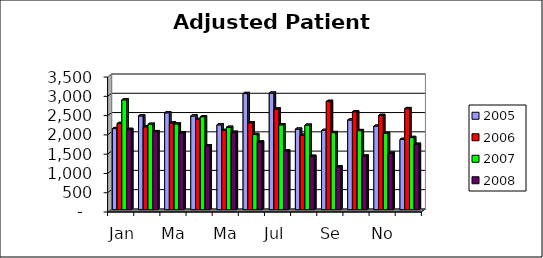
| Category | 2004 | 2005 | 2006 | 2007 | 2008 |
|---|---|---|---|---|---|
| Jan |  | 2101.477 | 2233.487 | 2847.642 | 2079.641 |
| Feb |  | 2429.972 | 2148.437 | 2212.652 | 2021.784 |
| Mar |  | 2511.316 | 2244.971 | 2220.498 | 1991.988 |
| Apr |  | 2429.029 | 2338.256 | 2408.74 | 1656.089 |
| May |  | 2199.625 | 2053.385 | 2134.922 | 2004.858 |
| Jun |  | 3010.699 | 2253.3 | 1947.715 | 1753.574 |
| Jul |  | 3021.699 | 2609.995 | 2198.284 | 1523.06 |
| Aug |  | 2087.341 | 1928.004 | 2189.621 | 1382.195 |
| Sep |  | 2052.88 | 2806.219 | 1997.505 | 1108.855 |
| Oct |  | 2324.974 | 2536.386 | 2048.875 | 1388.45 |
| Nov |  | 2165.706 | 2442.854 | 1977.222 | 1460.93 |
| Dec |  | 1821.122 | 2619.35 | 1869.637 | 1693.086 |